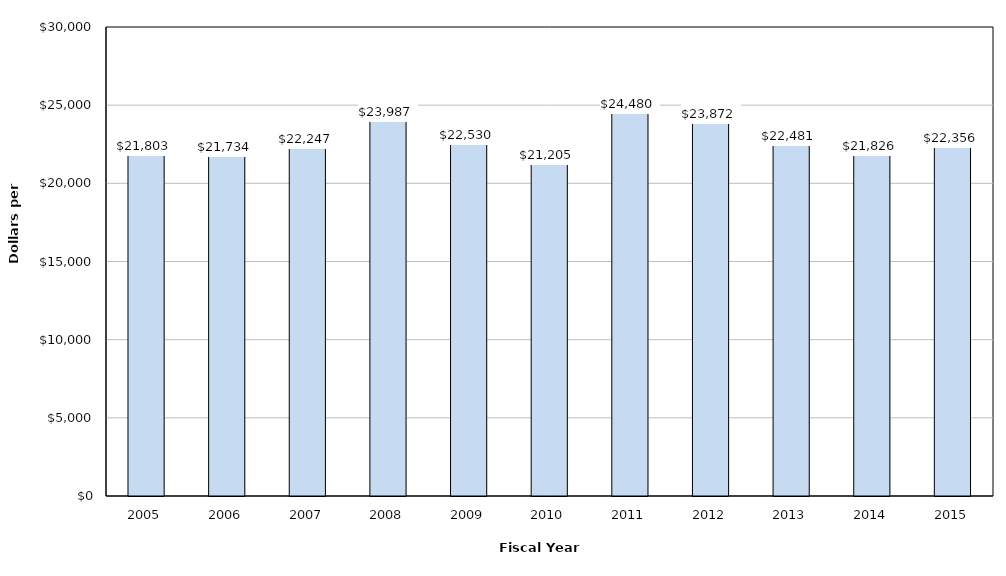
| Category | Series 1 |
|---|---|
| 2005.0 | 21803 |
| 2006.0 | 21734 |
| 2007.0 | 22247 |
| 2008.0 | 23987 |
| 2009.0 | 22530 |
| 2010.0 | 21205 |
| 2011.0 | 24480 |
| 2012.0 | 23872 |
| 2013.0 | 22481 |
| 2014.0 | 21826 |
| 2015.0 | 22356 |